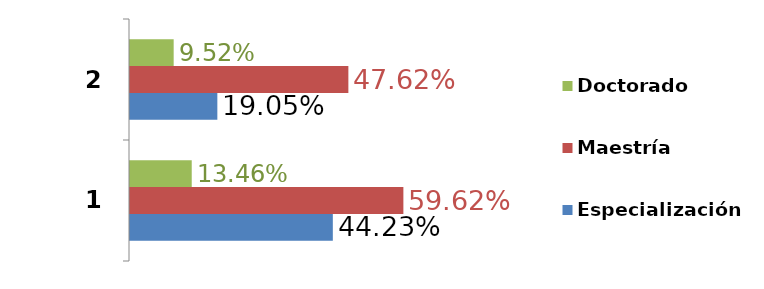
| Category | Especialización | Maestría | Doctorado |
|---|---|---|---|
| 0 | 0.442 | 0.596 | 0.135 |
| 1 | 0.19 | 0.476 | 0.095 |